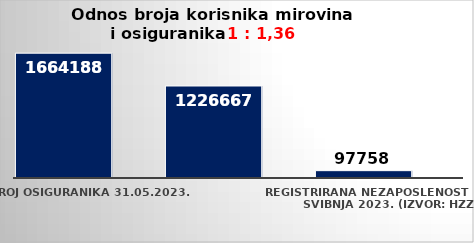
| Category | Series 0 | Series 1 |
|---|---|---|
| Broj osiguranika 31.05.2023. | 1664188 |  |
| Broj korisnika mirovine za svibanj 2023. (isplata u lipnju 2023.) | 1226667 |  |
| Registrirana nezaposlenost krajem svibnja 2023. (izvor: HZZ) | 97758 |  |